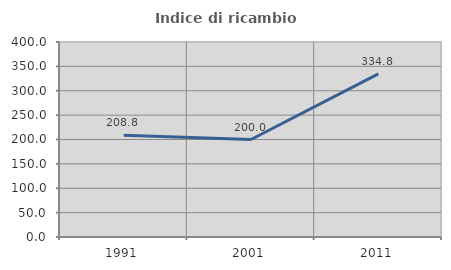
| Category | Indice di ricambio occupazionale  |
|---|---|
| 1991.0 | 208.824 |
| 2001.0 | 200 |
| 2011.0 | 334.783 |